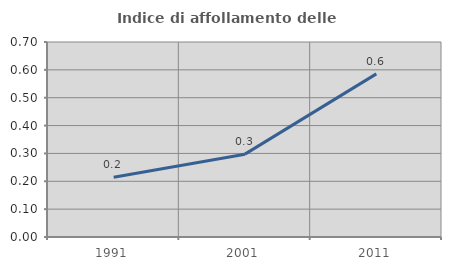
| Category | Indice di affollamento delle abitazioni  |
|---|---|
| 1991.0 | 0.214 |
| 2001.0 | 0.297 |
| 2011.0 | 0.585 |